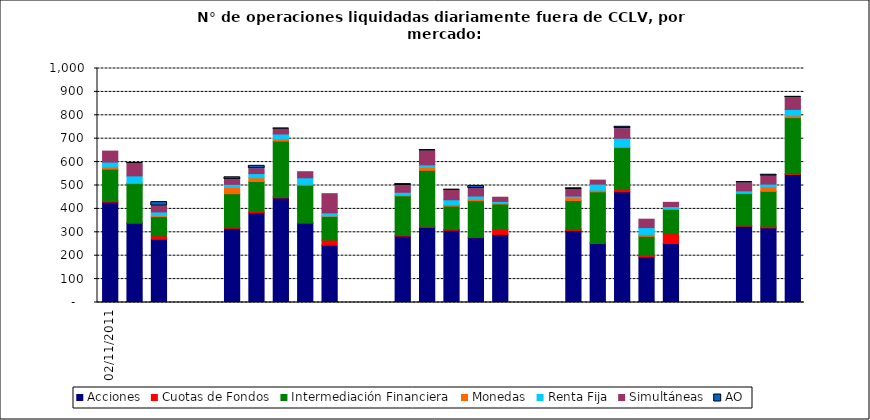
| Category | Acciones | Cuotas de Fondos | Intermediación Financiera | Monedas | Renta Fija | Simultáneas | AO |
|---|---|---|---|---|---|---|---|
| 02/11/2011 | 429 | 4 | 137 | 9 | 21 | 47 | 0 |
| 03/11/2011 | 339 | 2 | 167 | 4 | 29 | 52 | 3 |
| 04/11/2011 | 270 | 15 | 82 | 4 | 16 | 25 | 17 |
| 07/11/2011 | 317 | 3 | 145 | 27 | 13 | 20 | 10 |
| 08/11/2011 | 384 | 7 | 126 | 16 | 18 | 21 | 12 |
| 09/11/2011 | 447 | 6 | 237 | 10 | 20 | 21 | 2 |
| 10/11/2011 | 339 | 3 | 159 | 4 | 28 | 26 | 0 |
| 11/11/2011 | 245 | 22 | 101 | 2 | 13 | 82 | 0 |
| 14/11/2011 | 284 | 3 | 169 | 3 | 12 | 29 | 6 |
| 15/11/2011 | 321 | 5 | 239 | 13 | 10 | 61 | 1 |
| 16/11/2011 | 309 | 4 | 99 | 7 | 20 | 40 | 3 |
| 17/11/2011 | 277 | 2 | 156 | 6 | 14 | 32 | 11 |
| 18/11/2011 | 291 | 22 | 108 | 3 | 8 | 18 | 0 |
| 21/11/2011 | 308 | 7 | 121 | 12 | 7 | 28 | 5 |
| 22/11/2011 | 252 | 4 | 217 | 7 | 26 | 17 | 0 |
| 23/11/2011 | 473 | 10 | 179 | 5 | 35 | 41 | 8 |
| 24/11/2011 | 195 | 8 | 80 | 8 | 29 | 36 | 0 |
| 25/11/2011 | 252 | 42 | 104 | 4 | 8 | 18 | 0 |
| 28/11/2011 | 326 | 2 | 138 | 2 | 9 | 35 | 2 |
| 29/11/2011 | 319 | 7 | 149 | 19 | 12 | 34 | 6 |
| 30/11/2011 | 547 | 3 | 240 | 8 | 27 | 50 | 4 |